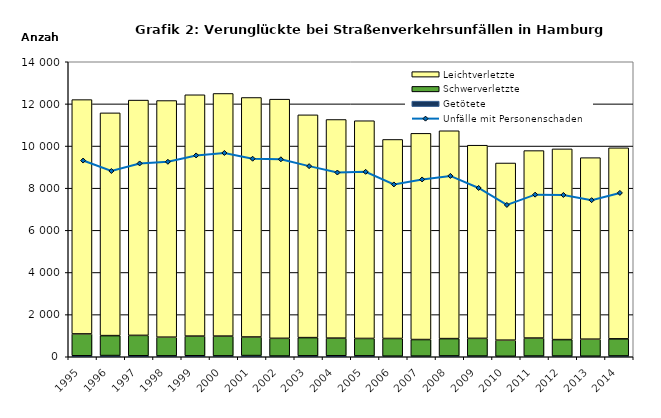
| Category | Getötete | Schwerverletzte | Leichtverletzte |
|---|---|---|---|
| 1995.0 | 46 | 1038 | 11120 |
| 1996.0 | 57 | 946 | 10571 |
| 1997.0 | 46 | 969 | 11166 |
| 1998.0 | 42 | 887 | 11230 |
| 1999.0 | 47 | 933 | 11453 |
| 2000.0 | 41 | 939 | 11515 |
| 2001.0 | 56 | 882 | 11366 |
| 2002.0 | 34 | 841 | 11350 |
| 2003.0 | 44 | 864 | 10573 |
| 2004.0 | 48 | 836 | 10376 |
| 2005.0 | 43 | 826 | 10332 |
| 2006.0 | 28 | 839 | 9446 |
| 2007.0 | 30 | 787 | 9786 |
| 2008.0 | 40 | 821 | 9864 |
| 2009.0 | 33 | 840 | 9167 |
| 2010.0 | 22 | 765 | 8408 |
| 2011.0 | 34 | 853 | 8897 |
| 2012.0 | 33 | 781 | 9051 |
| 2013.0 | 26 | 808 | 8615 |
| 2014.0 | 38 | 812 | 9066 |